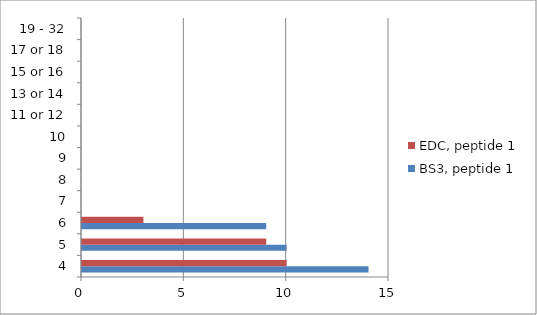
| Category | BS3, peptide 1 | EDC, peptide 1 |
|---|---|---|
| 4 | 14 | 10 |
| 5 | 10 | 9 |
| 6 | 9 | 3 |
| 7 | 0 | 0 |
| 8 | 0 | 0 |
| 9 | 0 | 0 |
| 10 | 0 | 0 |
| 11 or 12 | 0 | 0 |
| 13 or 14 | 0 | 0 |
| 15 or 16 | 0 | 0 |
| 17 or 18 | 0 | 0 |
| 19 - 32 | 0 | 0 |